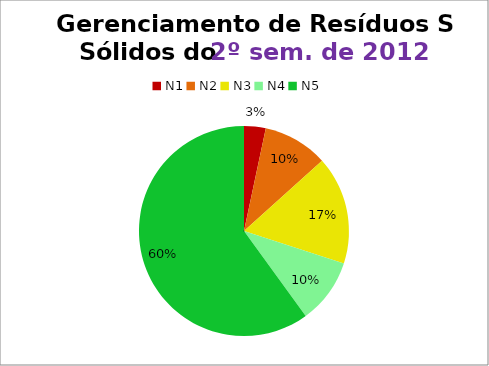
| Category | 2º/12 |
|---|---|
| N1 | 1 |
| N2 | 3 |
| N3 | 5 |
| N4 | 3 |
| N5 | 18 |